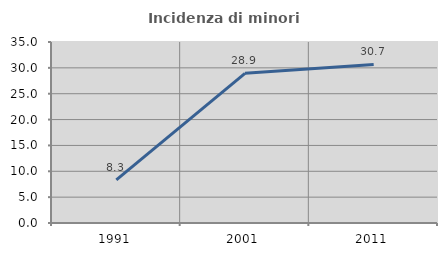
| Category | Incidenza di minori stranieri |
|---|---|
| 1991.0 | 8.333 |
| 2001.0 | 28.947 |
| 2011.0 | 30.667 |